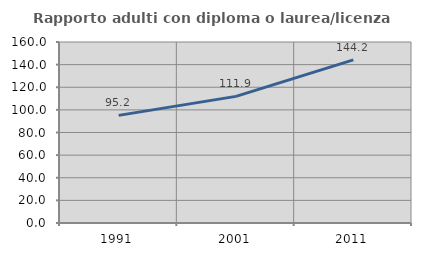
| Category | Rapporto adulti con diploma o laurea/licenza media  |
|---|---|
| 1991.0 | 95.152 |
| 2001.0 | 111.927 |
| 2011.0 | 144.167 |